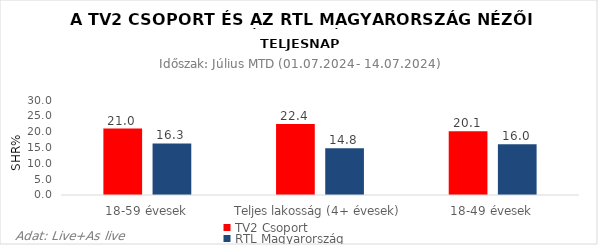
| Category | TV2 Csoport | RTL Magyarország |
|---|---|---|
| 18-59 évesek | 21 | 16.3 |
| Teljes lakosság (4+ évesek) | 22.4 | 14.8 |
| 18-49 évesek | 20.1 | 16 |